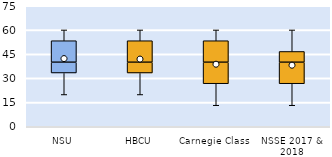
| Category | 25th | 50th | 75th |
|---|---|---|---|
| NSU | 33.333 | 6.667 | 13.333 |
| HBCU | 33.333 | 6.667 | 13.333 |
| Carnegie Class | 26.667 | 13.333 | 13.333 |
| NSSE 2017 & 2018 | 26.667 | 13.333 | 6.667 |